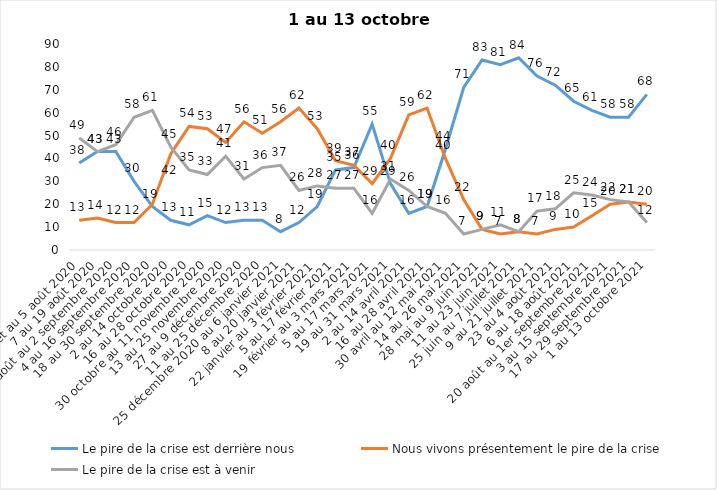
| Category | Le pire de la crise est derrière nous | Nous vivons présentement le pire de la crise | Le pire de la crise est à venir |
|---|---|---|---|
| 24 juillet au 5 août 2020 | 38 | 13 | 49 |
| 7 au 19 août 2020 | 43 | 14 | 43 |
| 21 août au 2 septembre 2020 | 43 | 12 | 46 |
| 4 au 16 septembre 2020 | 30 | 12 | 58 |
| 18 au 30 septembre 2020 | 19 | 20 | 61 |
| 2 au 14 octobre 2020 | 13 | 42 | 45 |
| 16 au 28 octobre 2020 | 11 | 54 | 35 |
| 30 octobre au 11 novembre 2020 | 15 | 53 | 33 |
| 13 au 25 novembre 2020 | 12 | 47 | 41 |
| 27 au 9 décembre 2020 | 13 | 56 | 31 |
| 11 au 25 décembre 2020 | 13 | 51 | 36 |
| 25 décembre 2020 au 6 janvier 2021 | 8 | 56 | 37 |
| 8 au 20 janvier 2021 | 12 | 62 | 26 |
| 22 janvier au 3 février 2021 | 19 | 53 | 28 |
| 5 au 17 février 2021 | 35 | 39 | 27 |
| 19 février au 3 mars 2021 | 36 | 37 | 27 |
| 5 au 17 mars 2021 | 55 | 29 | 16 |
| 19 au 31 mars 2021 | 29 | 40 | 31 |
| 2 au 14 avril 2021 | 16 | 59 | 26 |
| 16 au 28 avril 2021 | 19 | 62 | 19 |
| 30 avril au 12 mai 2021 | 44 | 40 | 16 |
| 14 au 26 mai 2021 | 71 | 22 | 7 |
| 28 mai au 9 juin 2021 | 83 | 9 | 9 |
| 11 au 23 juin 2021 | 81 | 7 | 11 |
| 25 juin au 7 juillet 2021 | 84 | 8 | 8 |
| 9 au 21 juillet 2021 | 76 | 7 | 17 |
| 23 au 4 août 2021 | 72 | 9 | 18 |
| 6 au 18 août 2021 | 65 | 10 | 25 |
| 20 août au 1er septembre 2021 | 61 | 15 | 24 |
| 3 au 15 septembre 2021 | 58 | 20 | 22 |
| 17 au 29 septembre 2021 | 58 | 21 | 21 |
| 1 au 13 octobre 2021 | 68 | 20 | 12 |